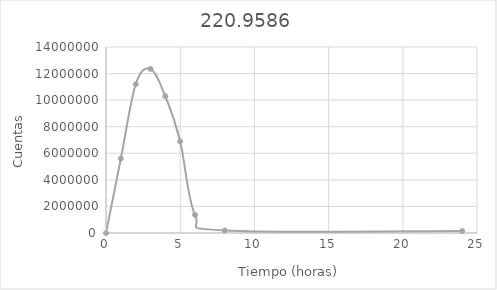
| Category | 220,9586 |
|---|---|
| 0.0 | 0 |
| 1.0 | 5605823.6 |
| 2.0 | 11191515.7 |
| 3.0 | 12349156.7 |
| 4.0 | 10293942.5 |
| 5.0 | 6891223.95 |
| 6.0 | 1364999.8 |
| 8.0 | 192985.7 |
| 24.0 | 148587 |